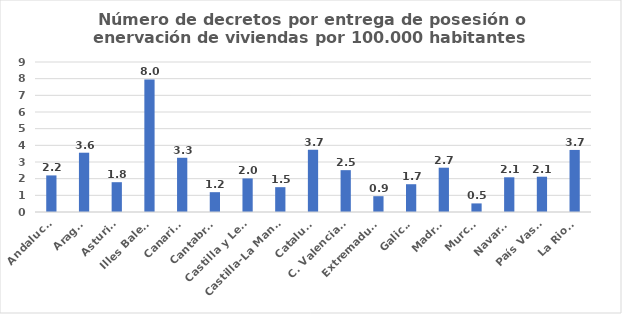
| Category | Numero de decretos por entrega de posesión o enervacion por 100.000 habitantes |
|---|---|
| Andalucía | 2.196 |
| Aragón | 3.557 |
| Asturias | 1.788 |
| Illes Balears | 7.955 |
| Canarias | 3.254 |
| Cantabria | 1.189 |
| Castilla y León | 2.015 |
| Castilla-La Mancha | 1.49 |
| Cataluña | 3.735 |
| C. Valenciana | 2.51 |
| Extremadura | 0.948 |
| Galicia | 1.667 |
| Madrid | 2.657 |
| Murcia | 0.515 |
| Navarra | 2.083 |
| País Vasco | 2.117 |
| La Rioja | 3.724 |